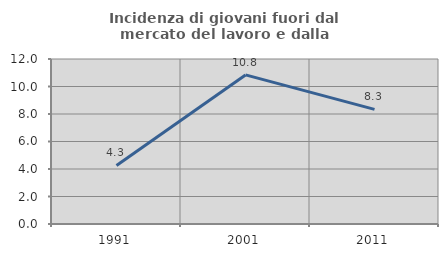
| Category | Incidenza di giovani fuori dal mercato del lavoro e dalla formazione  |
|---|---|
| 1991.0 | 4.255 |
| 2001.0 | 10.843 |
| 2011.0 | 8.333 |